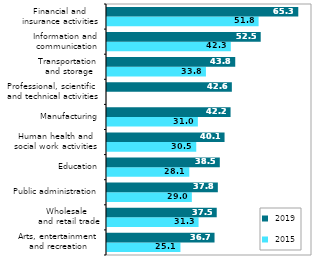
| Category |  2015 |  2019 |
|---|---|---|
| Arts, entertainment
 and recreation | 25.081 | 36.718 |
| Wholesale
 and retail trade | 31.266 | 37.47 |
| Public administration | 28.971 | 37.846 |
| Education | 28.102 | 38.518 |
| Human health and
 social work activities  | 30.478 | 40.14 |
| Manufacturing | 31.027 | 42.193 |
| Professional, scientific
 and technical activities | 0 | 42.631 |
| Transportation
 and storage | 33.781 | 43.789 |
| Information and
 communication | 42.279 | 52.488 |
| Financial and
 insurance activities | 51.764 | 65.315 |